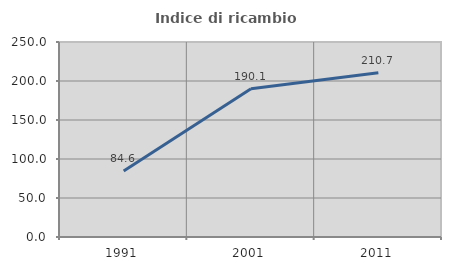
| Category | Indice di ricambio occupazionale  |
|---|---|
| 1991.0 | 84.559 |
| 2001.0 | 190.11 |
| 2011.0 | 210.714 |